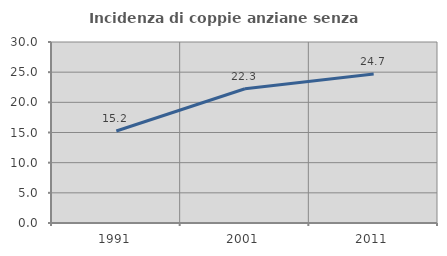
| Category | Incidenza di coppie anziane senza figli  |
|---|---|
| 1991.0 | 15.242 |
| 2001.0 | 22.251 |
| 2011.0 | 24.688 |